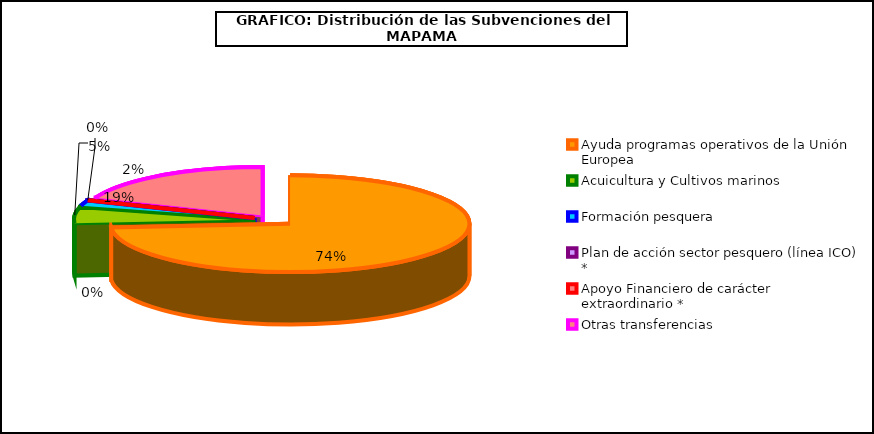
| Category | Series 0 |
|---|---|
| 0 | 4364.68 |
| 1 | 318.23 |
| 2 | 106.93 |
| 3 | 0 |
| 4 | 0 |
| 5 | 1127.15 |